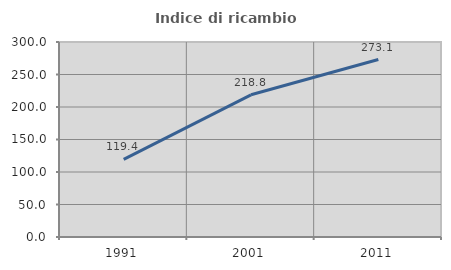
| Category | Indice di ricambio occupazionale  |
|---|---|
| 1991.0 | 119.38 |
| 2001.0 | 218.75 |
| 2011.0 | 273.077 |